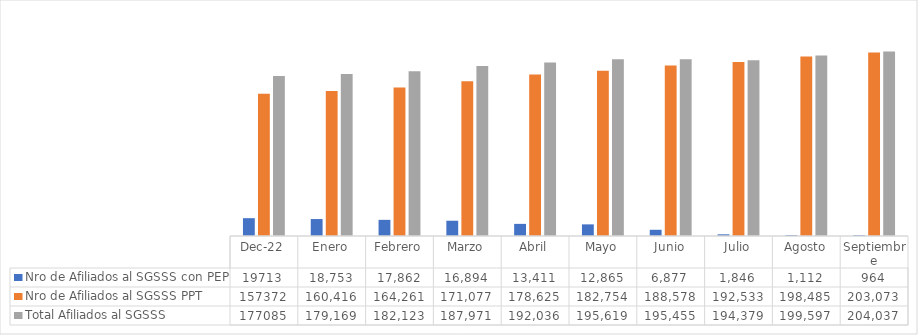
| Category | Nro de Afiliados al SGSSS con PEP | Nro de Afiliados al SGSSS PPT | Total Afiliados al SGSSS |
|---|---|---|---|
| dic-22 | 19713 | 157372 | 177085 |
| Enero | 18753 | 160416 | 179169 |
| Febrero | 17862 | 164261 | 182123 |
| Marzo | 16894 | 171077 | 187971 |
| Abril | 13411 | 178625 | 192036 |
| Mayo | 12865 | 182754 | 195619 |
| Junio | 6877 | 188578 | 195455 |
| Julio | 1846 | 192533 | 194379 |
| Agosto | 1112 | 198485 | 199597 |
| Septiembre | 964 | 203073 | 204037 |